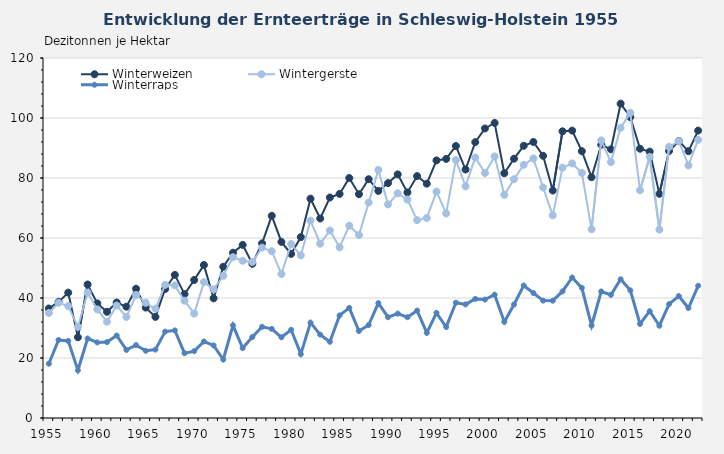
| Category | Winterweizen | Wintergerste | Winterraps |
|---|---|---|---|
| 1955.0 | 36.5 | 35 | 18.1 |
| 1956.0 | 38.7 | 38.4 | 26 |
| 1957.0 | 41.8 | 37.3 | 25.7 |
| 1958.0 | 26.9 | 30.4 | 15.9 |
| 1959.0 | 44.5 | 41.8 | 26.5 |
| 1960.0 | 38.2 | 36.2 | 25.2 |
| 1961.0 | 35.4 | 32.1 | 25.3 |
| 1962.0 | 38.5 | 37.5 | 27.5 |
| 1963.0 | 37.1 | 33.7 | 22.7 |
| 1964.0 | 43.1 | 41 | 24.3 |
| 1965.0 | 36.8 | 38.4 | 22.4 |
| 1966.0 | 33.7 | 36.4 | 22.8 |
| 1967.0 | 43 | 44.4 | 28.8 |
| 1968.0 | 47.7 | 44.2 | 29.2 |
| 1969.0 | 41.3 | 39.1 | 21.6 |
| 1970.0 | 46 | 34.8 | 22.3 |
| 1971.0 | 51 | 45.3 | 25.5 |
| 1972.0 | 39.9 | 42.9 | 24.2 |
| 1973.0 | 50.4 | 47.4 | 19.5 |
| 1974.0 | 55.1 | 53.6 | 30.9 |
| 1975.0 | 57.7 | 52.4 | 23.3 |
| 1976.0 | 51.4 | 52 | 27 |
| 1977.0 | 58.2 | 56.8 | 30.4 |
| 1978.0 | 67.4 | 55.6 | 29.7 |
| 1979.0 | 58.7 | 48 | 26.9 |
| 1980.0 | 54.7 | 58 | 29.4 |
| 1981.0 | 60.3 | 54.2 | 21.3 |
| 1982.0 | 73.1 | 65.8 | 31.8 |
| 1983.0 | 66.5 | 58.1 | 27.8 |
| 1984.0 | 73.5 | 62.5 | 25.4 |
| 1985.0 | 74.7 | 56.9 | 34.2 |
| 1986.0 | 80 | 64.1 | 36.7 |
| 1987.0 | 74.6 | 61 | 29 |
| 1988.0 | 79.6 | 71.8 | 31 |
| 1989.0 | 75.7 | 82.7 | 38.3 |
| 1990.0 | 78.3 | 71.2 | 33.6 |
| 1991.0 | 81.2 | 74.9 | 34.8 |
| 1992.0 | 75.2 | 72.8 | 33.6 |
| 1993.0 | 80.63 | 65.95 | 35.8 |
| 1994.0 | 78.11 | 66.69 | 28.36 |
| 1995.0 | 85.86 | 75.47 | 35.03 |
| 1996.0 | 86.37 | 68.18 | 30.33 |
| 1997.0 | 90.66 | 85.97 | 38.44 |
| 1998.0 | 82.83 | 77.22 | 37.87 |
| 1999.0 | 91.95 | 86.85 | 39.7 |
| 2000.0 | 96.51 | 81.67 | 39.48 |
| 2001.0 | 98.35 | 87.2 | 41.11 |
| 2002.0 | 81.58 | 74.39 | 32.03 |
| 2003.0 | 86.44 | 79.59 | 37.85 |
| 2004.0 | 90.74 | 84.4 | 44.17 |
| 2005.0 | 92.01 | 86.52 | 41.65 |
| 2006.0 | 87.4 | 76.84 | 39.13 |
| 2007.0 | 75.82 | 67.54 | 39.1 |
| 2008.0 | 95.56 | 83.42 | 42.19 |
| 2009.0 | 95.8 | 84.86 | 46.83 |
| 2010.0 | 88.93 | 81.68 | 43.38 |
| 2011.0 | 80.26 | 62.94 | 30.79 |
| 2012.0 | 91.08 | 92.53 | 42.17 |
| 2013.0 | 89.56 | 85.3 | 41.04 |
| 2014.0 | 104.79 | 96.75 | 46.24 |
| 2015.0 | 100.29 | 101.72 | 42.56 |
| 2016.0 | 89.75 | 75.88 | 31.36 |
| 2017.0 | 88.78 | 87.06 | 35.6 |
| 2018.0 | 74.72 | 62.79 | 30.76 |
| 2019.0 | 89.01 | 90.38 | 37.97 |
| 2020.0 | 92.35 | 92.27 | 40.64 |
| 2021.0 | 88.94 | 84.21 | 36.66 |
| 2022.0 | 95.81 | 92.74 | 44.06 |